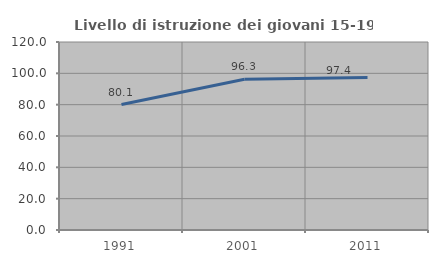
| Category | Livello di istruzione dei giovani 15-19 anni |
|---|---|
| 1991.0 | 80.09 |
| 2001.0 | 96.252 |
| 2011.0 | 97.397 |